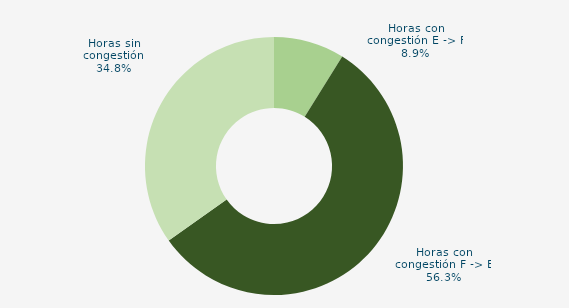
| Category | Horas con congestión E -> F |
|---|---|
| Horas con congestión E -> F | 8.871 |
| Horas con congestión F -> E | 56.317 |
| Horas sin congestión | 34.812 |